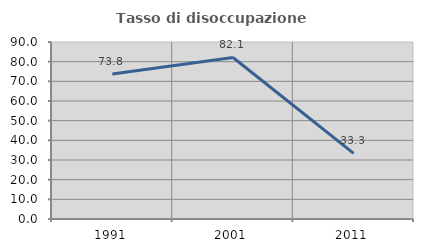
| Category | Tasso di disoccupazione giovanile  |
|---|---|
| 1991.0 | 73.75 |
| 2001.0 | 82.143 |
| 2011.0 | 33.333 |